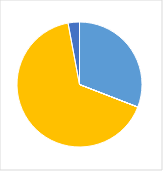
| Category | Series 0 |
|---|---|
| 0 | 0.304 |
| 1 | 0 |
| 2 | 0 |
| 3 | 0.652 |
| 4 | 0.029 |